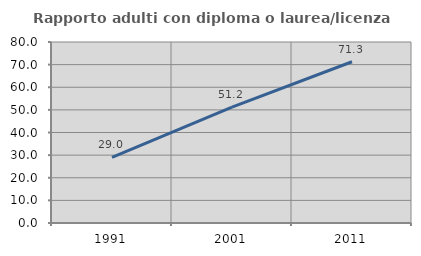
| Category | Rapporto adulti con diploma o laurea/licenza media  |
|---|---|
| 1991.0 | 29.032 |
| 2001.0 | 51.235 |
| 2011.0 | 71.282 |